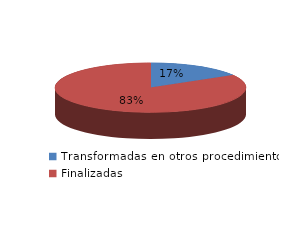
| Category | Series 0 |
|---|---|
| Transformadas en otros procedimientos | 1167 |
| Finalizadas | 5897 |